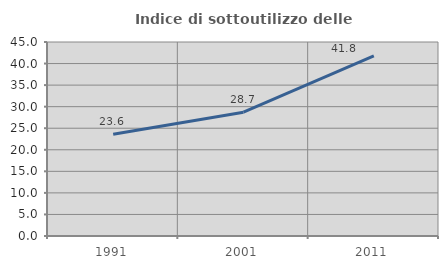
| Category | Indice di sottoutilizzo delle abitazioni  |
|---|---|
| 1991.0 | 23.587 |
| 2001.0 | 28.713 |
| 2011.0 | 41.797 |